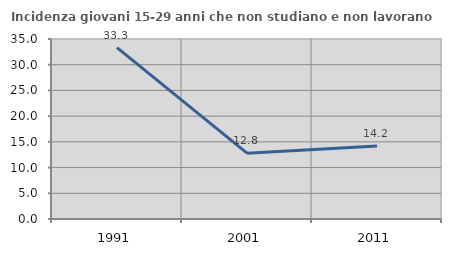
| Category | Incidenza giovani 15-29 anni che non studiano e non lavorano  |
|---|---|
| 1991.0 | 33.333 |
| 2001.0 | 12.807 |
| 2011.0 | 14.194 |